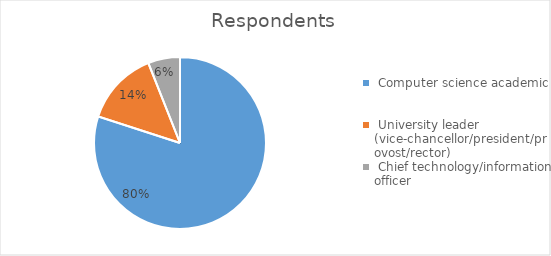
| Category | Series 0 |
|---|---|
|  Computer science academic | 0.8 |
|  University leader (vice-chancellor/president/provost/rector) | 0.14 |
|  Chief technology/information officer | 0.06 |